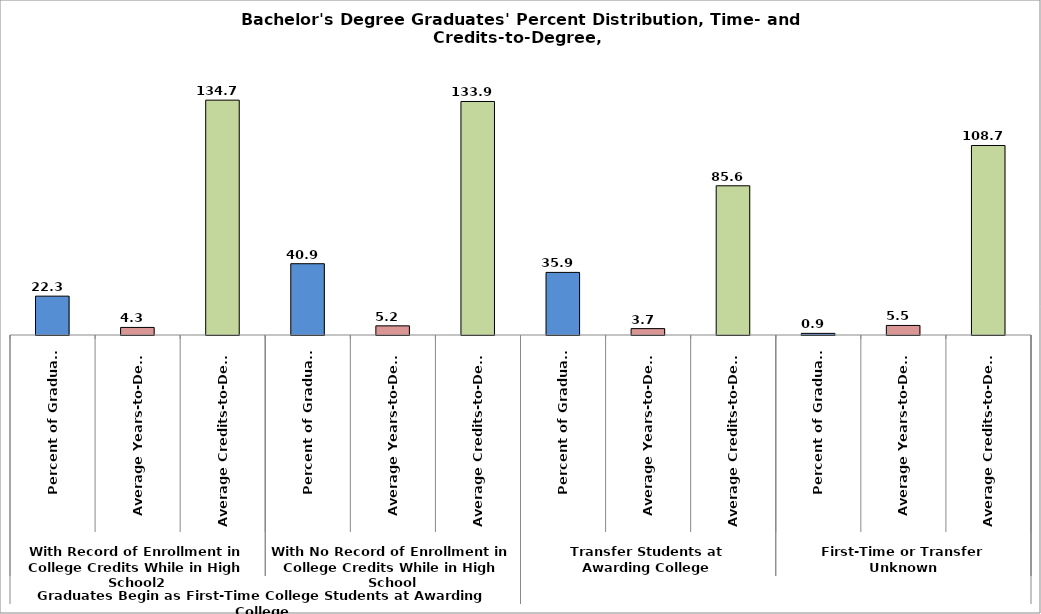
| Category | Series 0 |
|---|---|
| 0 | 22.28 |
| 1 | 4.337 |
| 2 | 134.678 |
| 3 | 40.883 |
| 4 | 5.245 |
| 5 | 133.919 |
| 6 | 35.898 |
| 7 | 3.665 |
| 8 | 85.572 |
| 9 | 0.939 |
| 10 | 5.475 |
| 11 | 108.68 |